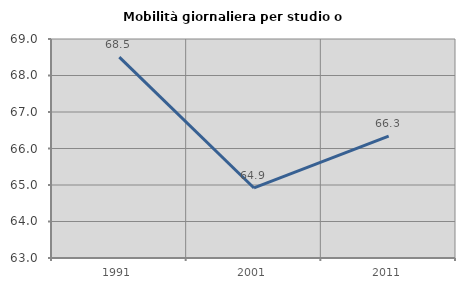
| Category | Mobilità giornaliera per studio o lavoro |
|---|---|
| 1991.0 | 68.501 |
| 2001.0 | 64.919 |
| 2011.0 | 66.338 |